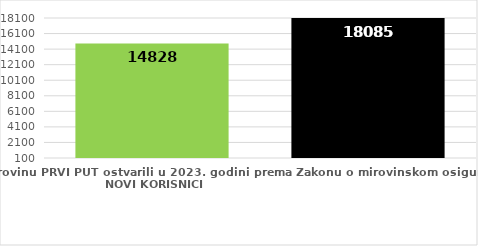
| Category | broj korisnika |
|---|---|
| Korisnici koji su pravo na mirovinu PRVI PUT ostvarili u 2023. godini prema Zakonu o mirovinskom osiguranju - NOVI KORISNICI | 14828 |
| Korisnici mirovina kojima je u 2023. godini PRESTALO PRAVO NA MIROVINU - uzrok smrt 
koji su pravo na mirovinu ostvarili prema Zakonu o mirovinskom osiguranju | 18085 |